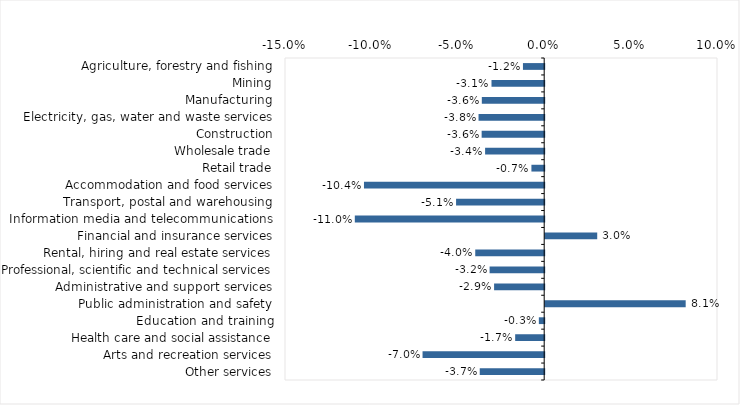
| Category | This week |
|---|---|
| Agriculture, forestry and fishing | -0.012 |
| Mining | -0.03 |
| Manufacturing | -0.036 |
| Electricity, gas, water and waste services | -0.038 |
| Construction | -0.036 |
| Wholesale trade | -0.034 |
| Retail trade | -0.007 |
| Accommodation and food services | -0.104 |
| Transport, postal and warehousing | -0.051 |
| Information media and telecommunications | -0.11 |
| Financial and insurance services | 0.03 |
| Rental, hiring and real estate services | -0.04 |
| Professional, scientific and technical services | -0.032 |
| Administrative and support services | -0.029 |
| Public administration and safety | 0.081 |
| Education and training | -0.003 |
| Health care and social assistance | -0.017 |
| Arts and recreation services | -0.07 |
| Other services | -0.037 |